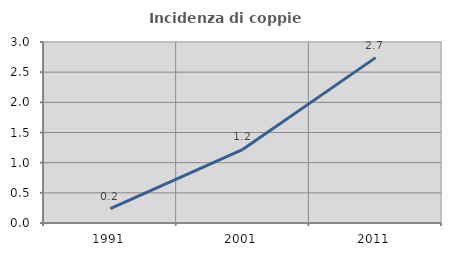
| Category | Incidenza di coppie miste |
|---|---|
| 1991.0 | 0.238 |
| 2001.0 | 1.221 |
| 2011.0 | 2.741 |